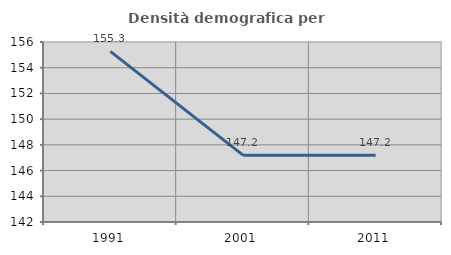
| Category | Densità demografica |
|---|---|
| 1991.0 | 155.271 |
| 2001.0 | 147.198 |
| 2011.0 | 147.198 |